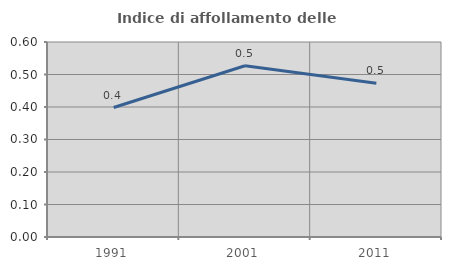
| Category | Indice di affollamento delle abitazioni  |
|---|---|
| 1991.0 | 0.398 |
| 2001.0 | 0.527 |
| 2011.0 | 0.473 |